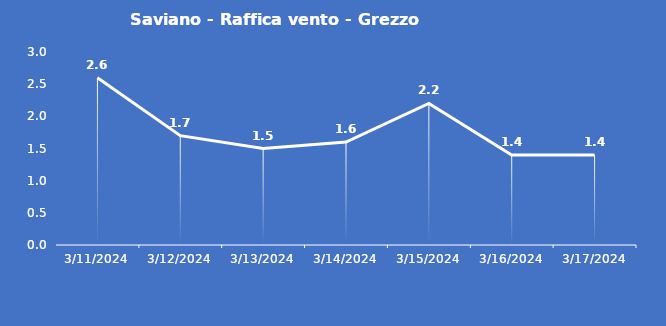
| Category | Saviano - Raffica vento - Grezzo (m/s) |
|---|---|
| 3/11/24 | 2.6 |
| 3/12/24 | 1.7 |
| 3/13/24 | 1.5 |
| 3/14/24 | 1.6 |
| 3/15/24 | 2.2 |
| 3/16/24 | 1.4 |
| 3/17/24 | 1.4 |